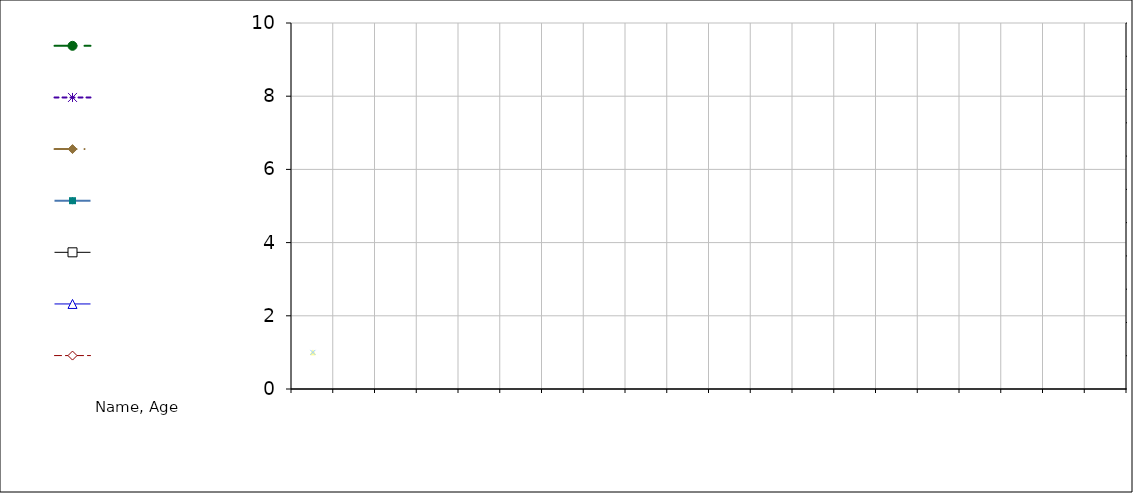
| Category | Series 3 | Series 4 | Series 5 | Series 6 | Series 7 | Series 8 | Series 9 | Series 10 | #REF! | Series 16 | Series 17 | Series 18 | #BEZUG! |
|---|---|---|---|---|---|---|---|---|---|---|---|---|---|
|  |  |  |  |  |  |  |  |  |  |  |  |  |  |
|  |  |  |  |  |  |  |  |  |  |  |  |  |  |
|  |  |  |  |  |  |  |  |  |  |  |  |  |  |
|  |  |  |  |  |  |  |  |  |  |  |  |  |  |
|  |  |  |  |  |  |  |  |  |  |  |  |  |  |
|  |  |  |  |  |  |  |  |  |  |  |  |  |  |
|  |  |  |  |  |  |  |  |  |  |  |  |  |  |
|  |  |  |  |  |  |  |  |  |  |  |  |  |  |
|  |  |  |  |  |  |  |  |  |  |  |  |  |  |
|  |  |  |  |  |  |  |  |  |  |  |  |  |  |
|  |  |  |  |  |  |  |  |  |  |  |  |  |  |
|  |  |  |  |  |  |  |  |  |  |  |  |  |  |
|  |  |  |  |  |  |  |  |  |  |  |  |  |  |
|  |  |  |  |  |  |  |  |  |  |  |  |  |  |
|  |  |  |  |  |  |  |  |  |  |  |  |  |  |
|  |  |  |  |  |  |  |  |  |  |  |  |  |  |
|  |  |  |  |  |  |  |  |  |  |  |  |  |  |
|  |  |  |  |  |  |  |  |  |  |  |  |  |  |
|  |  |  |  |  |  |  |  |  |  |  |  |  |  |
|  |  |  |  |  |  |  |  |  |  |  |  |  |  |